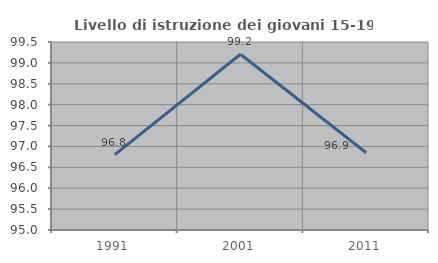
| Category | Livello di istruzione dei giovani 15-19 anni |
|---|---|
| 1991.0 | 96.804 |
| 2001.0 | 99.206 |
| 2011.0 | 96.85 |